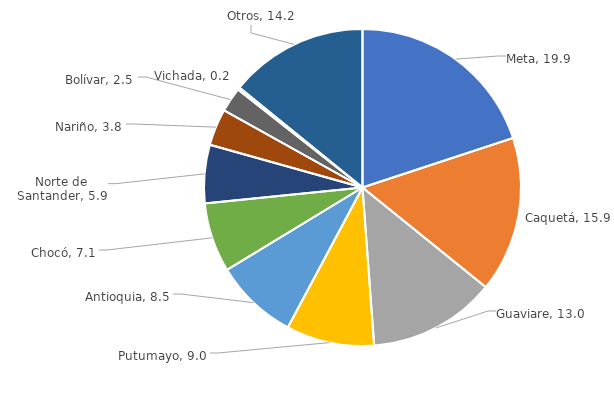
| Category | Participación 2022 |
|---|---|
| Meta | 19.943 |
| Caquetá | 15.876 |
| Guaviare | 13.004 |
| Putumayo | 8.977 |
| Antioquia | 8.512 |
| Chocó | 7.088 |
| Norte de Santander | 5.938 |
| Nariño | 3.751 |
| Bolívar | 2.517 |
| Vichada | 0.242 |
| Otros | 14.151 |